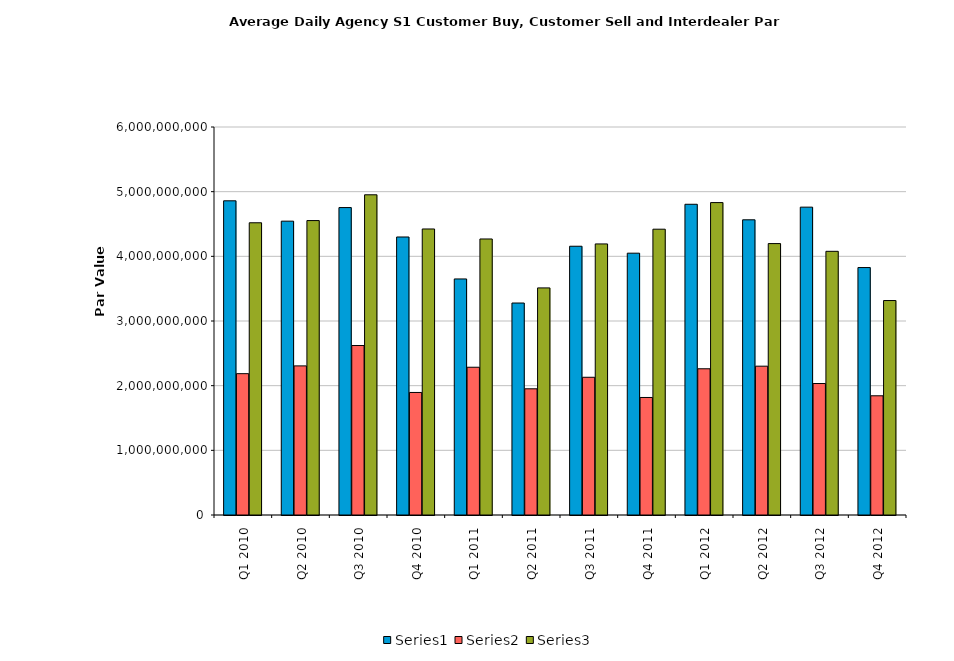
| Category | Series 0 | Series 1 | Series 2 |
|---|---|---|---|
| Q1 2010 | 4858619375.474 | 2185588120.792 | 4519073123.667 |
| Q2 2010 | 4543971747.97 | 2305894982.222 | 4553072903.846 |
| Q3 2010 | 4754031557.96 | 2620680990.156 | 4951733425.241 |
| Q4 2010 | 4298988228.978 | 1895014039.473 | 4422971308.328 |
| Q1 2011 | 3650213750.701 | 2284978454.007 | 4268516681.583 |
| Q2 2011 | 3278018479.981 | 1951447853.367 | 3511817513.696 |
| Q3 2011 | 4156019129.176 | 2129817820.81 | 4191803339.987 |
| Q4 2011 | 4048809559.675 | 1817417340.88 | 4419578741.148 |
| Q1 2012 | 4805131828.855 | 2261198234.689 | 4831201719.361 |
| Q2 2012 | 4564915316.16 | 2301348797.814 | 4197235917.869 |
| Q3 2012 | 4760626093.801 | 2033059819.746 | 4077567226.814 |
| Q4 2012 | 3826428782.592 | 1843370485.961 | 3316352390.939 |